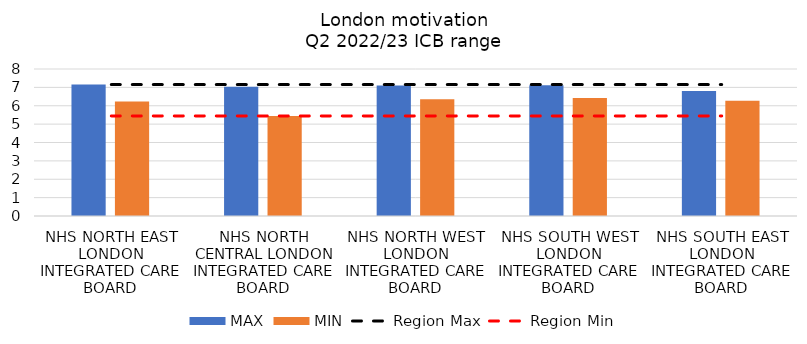
| Category | MAX | MIN |
|---|---|---|
| NHS NORTH EAST LONDON INTEGRATED CARE BOARD | 7.152 | 6.23 |
| NHS NORTH CENTRAL LONDON INTEGRATED CARE BOARD | 7.03 | 5.447 |
| NHS NORTH WEST LONDON INTEGRATED CARE BOARD | 7.096 | 6.356 |
| NHS SOUTH WEST LONDON INTEGRATED CARE BOARD | 7.109 | 6.416 |
| NHS SOUTH EAST LONDON INTEGRATED CARE BOARD | 6.806 | 6.27 |